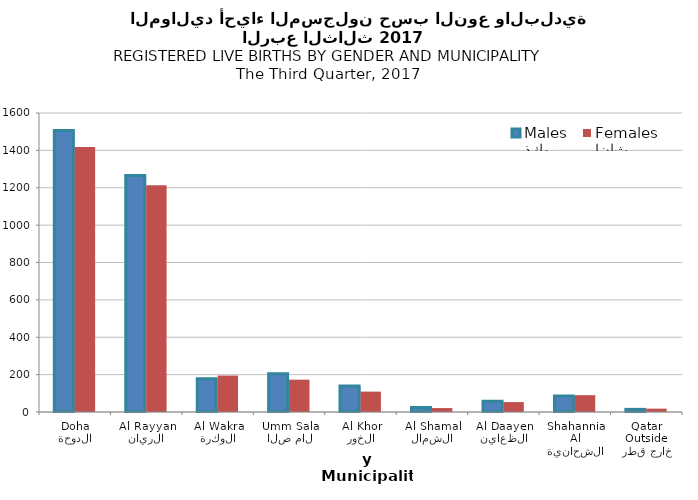
| Category | ذكور
Males | إناث
Females |
|---|---|---|
| الدوحة
Doha | 1506 | 1418 |
| الريان
Al Rayyan | 1266 | 1213 |
| الوكرة
Al Wakra | 178 | 195 |
| ام صلال
Umm Salal | 205 | 173 |
| الخور
Al Khor | 139 | 109 |
| الشمال
Al Shamal | 24 | 21 |
| الظعاين
Al Daayen | 58 | 53 |
| الشحانية
Al Shahannia | 86 | 90 |
| خارج قطر
Outside Qatar | 14 | 18 |